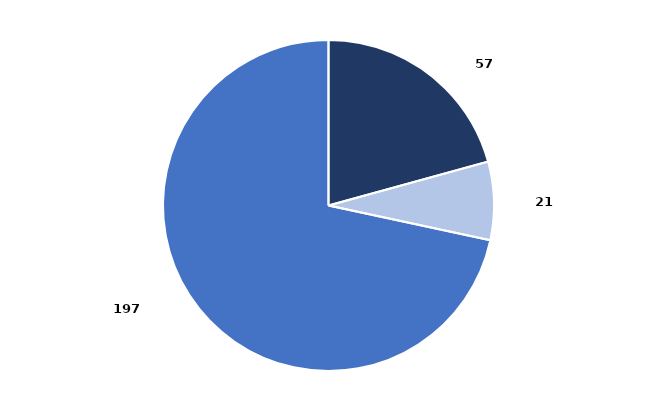
| Category | Series 0 |
|---|---|
| Criterio de Oportunidad | 0.207 |
| Conciliación | 0.076 |
| Suspensión Condicional del Procedimiento | 0.716 |